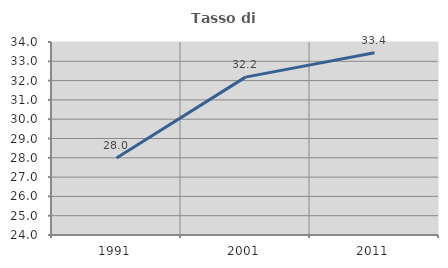
| Category | Tasso di occupazione   |
|---|---|
| 1991.0 | 27.988 |
| 2001.0 | 32.18 |
| 2011.0 | 33.444 |